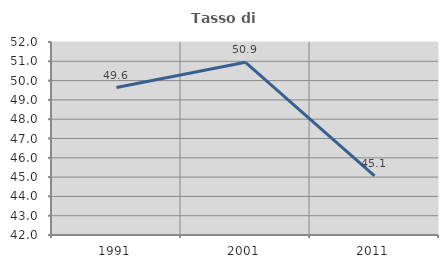
| Category | Tasso di occupazione   |
|---|---|
| 1991.0 | 49.638 |
| 2001.0 | 50.947 |
| 2011.0 | 45.063 |